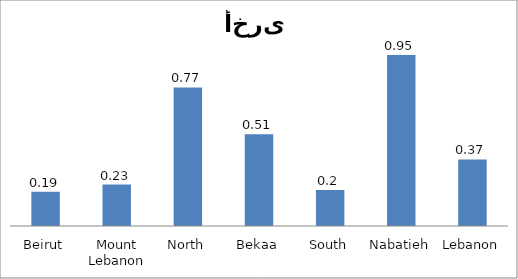
| Category | Series 0 |
|---|---|
| Beirut | 0.19 |
| Mount Lebanon | 0.23 |
| North | 0.77 |
| Bekaa | 0.51 |
| South | 0.2 |
| Nabatieh | 0.95 |
| Lebanon | 0.37 |